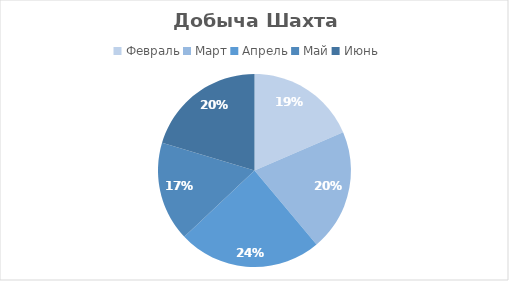
| Category | Шахта B |
|---|---|
| Февраль | 50 |
| Март | 55 |
| Апрель | 65 |
| Май | 45 |
| Июнь | 55 |